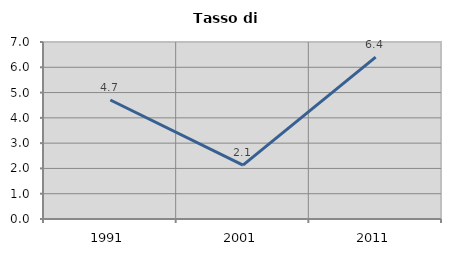
| Category | Tasso di disoccupazione   |
|---|---|
| 1991.0 | 4.706 |
| 2001.0 | 2.128 |
| 2011.0 | 6.4 |